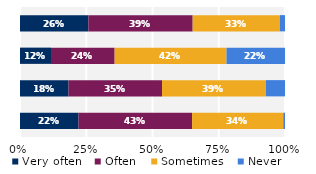
| Category | Very often | Often | Sometimes | Never |
|---|---|---|---|---|
| Talked about students' career plans | 0.258 | 0.394 | 0.329 | 0.019 |
| Worked on activities other than 
coursework | 0.117 | 0.24 | 0.422 | 0.221 |
| Discussed course topics, ideas, or concepts 
outside of class | 0.183 | 0.353 | 0.392 | 0.072 |
| Discussed students' academic performance | 0.221 | 0.429 | 0.344 | 0.006 |